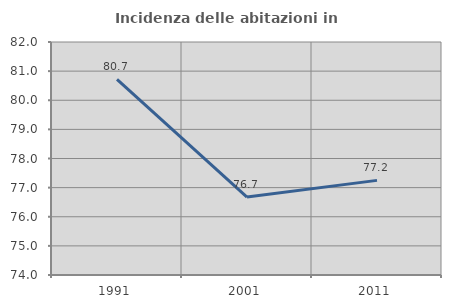
| Category | Incidenza delle abitazioni in proprietà  |
|---|---|
| 1991.0 | 80.72 |
| 2001.0 | 76.675 |
| 2011.0 | 77.249 |